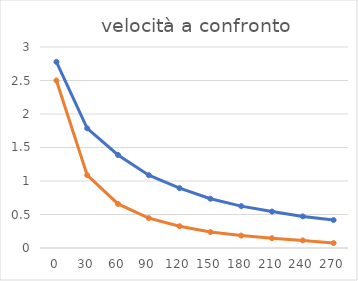
| Category | Series 0 | alluminio |
|---|---|---|
| 0.0 | 2.778 | 2.5 |
| 30.0 | 1.786 | 1.087 |
| 60.0 | 1.389 | 0.658 |
| 90.0 | 1.087 | 0.446 |
| 120.0 | 0.893 | 0.325 |
| 150.0 | 0.735 | 0.238 |
| 180.0 | 0.625 | 0.185 |
| 210.0 | 0.543 | 0.146 |
| 240.0 | 0.472 | 0.113 |
| 270.0 | 0.417 | 0.073 |